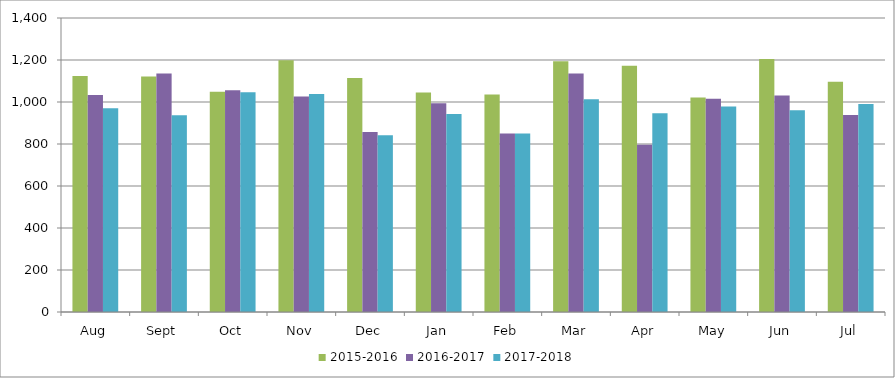
| Category | 2015-2016 | 2016-2017 | 2017-2018 |
|---|---|---|---|
| Aug | 1124 | 1033 | 970 |
| Sept | 1121 | 1136 | 937 |
| Oct | 1049 | 1056 | 1047 |
| Nov | 1199 | 1026 | 1038 |
| Dec | 1114 | 857 | 842 |
| Jan | 1045 | 994 | 943 |
| Feb | 1036 | 850 | 850 |
| Mar | 1194 | 1136 | 1013 |
| Apr | 1173 | 796 | 947 |
| May | 1021 | 1016 | 978 |
| Jun | 1205 | 1031 | 961 |
| Jul | 1096 | 938 | 990 |